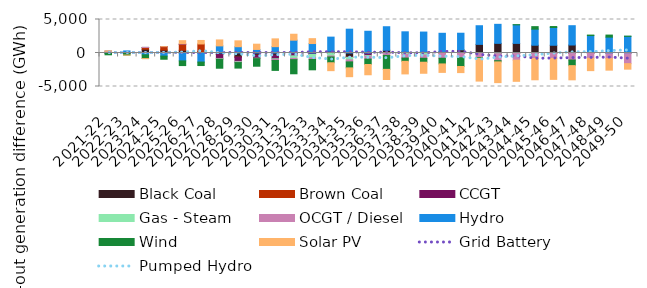
| Category | Black Coal | Brown Coal | CCGT | Gas - Steam | OCGT / Diesel | Hydro | Wind | Solar PV |
|---|---|---|---|---|---|---|---|---|
| 2021-22 | 70.551 | 205.407 | 0 | 1.166 | 1.313 | -3.696 | -266.415 | 0.001 |
| 2022-23 | 29.287 | 40.265 | 0 | 0.473 | 0.655 | 240.27 | -308.88 | 0 |
| 2023-24 | 566.598 | 253.911 | 10.478 | 1.238 | 3.064 | -276.059 | -554.358 | -3.665 |
| 2024-25 | 437.815 | 509.677 | 0.091 | -18.601 | -33.058 | -412.664 | -467.339 | 0.003 |
| 2025-26 | 403.172 | 875.932 | 74.68 | -4.904 | -4.384 | -1170.193 | -697.497 | 488.556 |
| 2026-27 | 191.857 | 1155.011 | -13.285 | -5.422 | -3.568 | -1331.37 | -517.7 | 524.87 |
| 2027-28 | -228.957 | -0.009 | -586.461 | -61.219 | -53.761 | 1062.311 | -1341.71 | 888.843 |
| 2028-29 | -607.188 | -0.006 | -649.695 | -79.171 | -93.872 | 940.394 | -822.146 | 874.842 |
| 2029-30 | -338.801 | -0.006 | -437.464 | -44.527 | -26.039 | 530.866 | -1125.367 | 783.839 |
| 2030-31 | -351.494 | -0.006 | -513.991 | -105.823 | -141.523 | 948.223 | -1483.717 | 1161.696 |
| 2031-32 | 31.301 | -0.005 | -419.684 | -379.819 | -191.018 | 1880.832 | -2111.112 | 887.444 |
| 2032-33 | -102.026 | -0.005 | -119.199 | -514.215 | -233.109 | 1412.786 | -1540.622 | 728.406 |
| 2033-34 | 257.025 | -0.006 | -15.619 | -431.265 | -144.304 | 2112.333 | -864.506 | -1179.363 |
| 2034-35 | -619.806 | -0.005 | -30.212 | -373.939 | -302.003 | 3553.744 | -895.829 | -1313.547 |
| 2035-36 | -50.048 | -0.005 | -318.001 | -111.228 | -425.669 | 3243.993 | -812.978 | -1529.8 |
| 2036-37 | 407.531 | -0.004 | -43.809 | -40.841 | -274.571 | 3513.181 | -2082.512 | -1515.291 |
| 2037-38 | 181.308 | -0.002 | -56.576 | -128.025 | -571.647 | 2980.52 | -484.835 | -1879.47 |
| 2038-39 | 198.43 | -0.003 | -1.308 | -291.533 | -499.754 | 2926.544 | -583.963 | -1649.096 |
| 2039-40 | 154.023 | -0.002 | 17.888 | 2.714 | -787.55 | 2766.467 | -843.97 | -1262.645 |
| 2040-41 | 501.147 | -0.002 | -25.687 | 0.158 | -683.528 | 2449 | -1304.602 | -911.556 |
| 2041-42 | 1288.291 | -0.002 | -24.961 | -2.264 | -652.085 | 2781.556 | -114.61 | -3399.468 |
| 2042-43 | 1438.794 | -0.003 | -99.797 | -8.53 | -1040.492 | 2840.62 | -176.427 | -3096.254 |
| 2043-44 | 1435.152 | -0.003 | -75.698 | -3.613 | -989.319 | 2768.644 | 24.395 | -3159.611 |
| 2044-45 | 1158.218 | -0.003 | -33.272 | -3.096 | -782.071 | 2399.607 | 376.615 | -3179.033 |
| 2045-46 | 1153.613 | -0.001 | -5.691 | -1.293 | -795.142 | 2653.932 | 142.057 | -3136.002 |
| 2046-47 | 1192.167 | -0.001 | 0 | 0 | -1047.137 | 2882.11 | -836.806 | -2119.89 |
| 2047-48 | 111.64 | 0 | 0 | 0 | -787.089 | 2490.697 | 71.326 | -1844.73 |
| 2048-49 | 31.413 | 0 | 0 | 0 | -838.235 | 2336.13 | 308.358 | -1722.1 |
| 2049-50 | 42.58 | 0 | -0.001 | 0 | -1588.371 | 2439.25 | 32.858 | -823.931 |